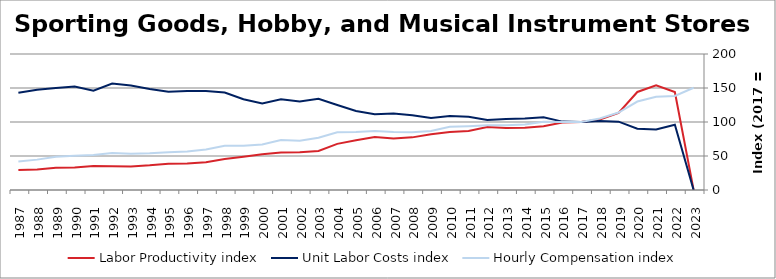
| Category | Labor Productivity index | Unit Labor Costs index | Hourly Compensation index |
|---|---|---|---|
| 2023.0 | 0 | 0 | 150.421 |
| 2022.0 | 144.102 | 95.97 | 138.294 |
| 2021.0 | 154.134 | 88.993 | 137.169 |
| 2020.0 | 144.179 | 90.243 | 130.111 |
| 2019.0 | 113.442 | 100.467 | 113.972 |
| 2018.0 | 103.73 | 101.4 | 105.182 |
| 2017.0 | 100 | 100 | 100 |
| 2016.0 | 99.257 | 100.578 | 99.831 |
| 2015.0 | 93.697 | 107.088 | 100.337 |
| 2014.0 | 91.644 | 105.132 | 96.347 |
| 2013.0 | 91.145 | 104.329 | 95.091 |
| 2012.0 | 92.463 | 102.86 | 95.108 |
| 2011.0 | 86.851 | 107.878 | 93.693 |
| 2010.0 | 85.395 | 108.718 | 92.84 |
| 2009.0 | 82.038 | 105.953 | 86.921 |
| 2008.0 | 77.401 | 109.872 | 85.041 |
| 2007.0 | 75.92 | 112.459 | 85.379 |
| 2006.0 | 77.889 | 111.305 | 86.695 |
| 2005.0 | 73.245 | 116.318 | 85.197 |
| 2004.0 | 67.856 | 125 | 84.821 |
| 2003.0 | 57.392 | 134.118 | 76.973 |
| 2002.0 | 55.635 | 130.203 | 72.439 |
| 2001.0 | 55.035 | 133.405 | 73.419 |
| 2000.0 | 52.618 | 127.421 | 67.047 |
| 1999.0 | 48.815 | 133.423 | 65.13 |
| 1998.0 | 45.435 | 143.436 | 65.171 |
| 1997.0 | 40.795 | 145.702 | 59.44 |
| 1996.0 | 38.885 | 145.55 | 56.597 |
| 1995.0 | 38.568 | 144.376 | 55.682 |
| 1994.0 | 36.315 | 148.667 | 53.989 |
| 1993.0 | 34.71 | 153.638 | 53.327 |
| 1992.0 | 34.771 | 156.52 | 54.424 |
| 1991.0 | 35.348 | 145.953 | 51.591 |
| 1990.0 | 33.15 | 152.181 | 50.448 |
| 1989.0 | 32.617 | 150.108 | 48.96 |
| 1988.0 | 30.285 | 147.501 | 44.671 |
| 1987.0 | 29.275 | 142.873 | 41.827 |